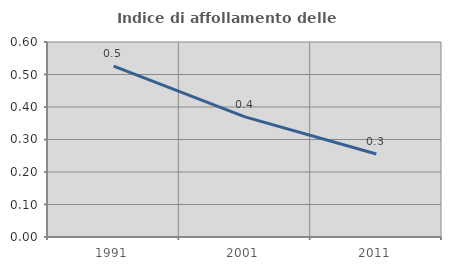
| Category | Indice di affollamento delle abitazioni  |
|---|---|
| 1991.0 | 0.526 |
| 2001.0 | 0.37 |
| 2011.0 | 0.256 |